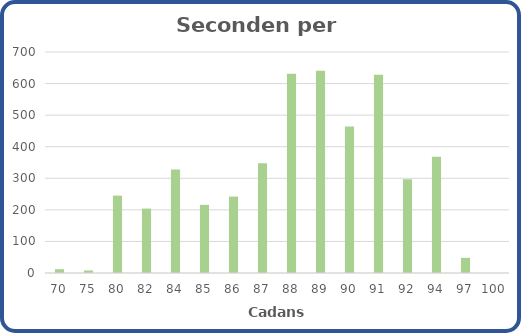
| Category | Seconden |
|---|---|
| 70.0 | 12 |
| 75.0 | 8 |
| 80.0 | 245 |
| 82.0 | 204 |
| 84.0 | 328 |
| 85.0 | 216 |
| 86.0 | 242 |
| 87.0 | 348 |
| 88.0 | 631 |
| 89.0 | 641 |
| 90.0 | 464 |
| 91.0 | 628 |
| 92.0 | 297 |
| 94.0 | 368 |
| 97.0 | 48 |
| 100.0 | 0 |